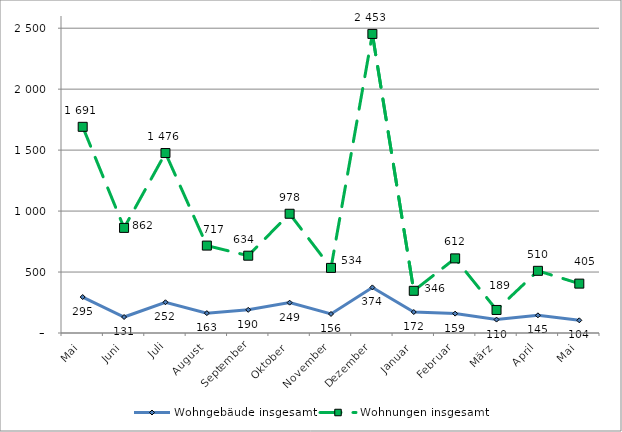
| Category | Wohngebäude insgesamt | Wohnungen insgesamt |
|---|---|---|
| Mai | 295 | 1691 |
| Juni | 131 | 862 |
| Juli | 252 | 1476 |
| August | 163 | 717 |
| September | 190 | 634 |
| Oktober | 249 | 978 |
| November | 156 | 534 |
| Dezember | 374 | 2453 |
| Januar | 172 | 346 |
| Februar | 159 | 612 |
| März | 110 | 189 |
| April | 145 | 510 |
| Mai | 104 | 405 |